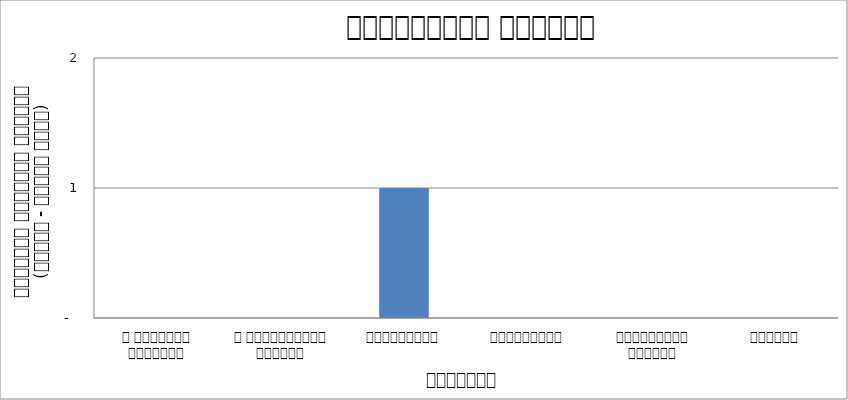
| Category | प्राकृतिक प्रकोप |
|---|---|
| द हिमालयन टाइम्स् | 0 |
| द काठमाण्डौं पोस्ट् | 0 |
| रिपब्लिका | 1 |
| कान्तिपुर | 0 |
| अन्नपूर्ण पोस्ट् | 0 |
| नागरिक | 0 |